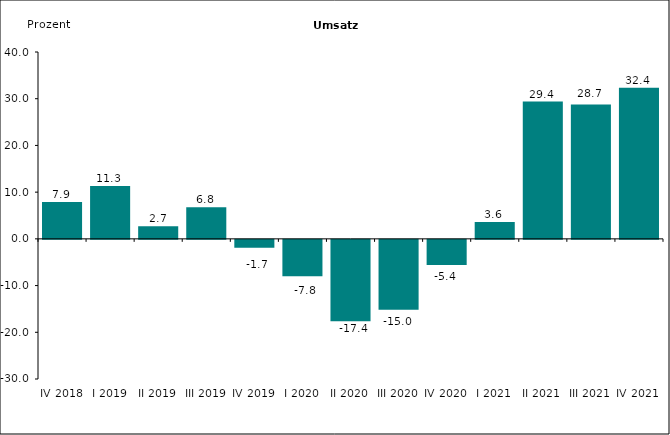
| Category | 7,9 |
|---|---|
| IV 2018 | 7.9 |
| I 2019 | 11.3 |
| II 2019 | 2.702 |
| III 2019 | 6.777 |
| IV 2019 | -1.702 |
| I 2020 | -7.775 |
| II 2020 | -17.405 |
| III 2020 | -14.955 |
| IV 2020 | -5.368 |
| I 2021 | 3.627 |
| II 2021 | 29.396 |
| III 2021 | 28.748 |
| IV 2021 | 32.367 |